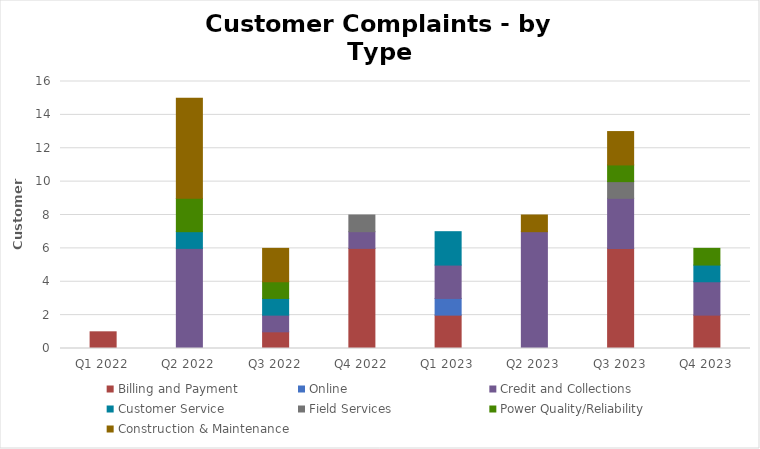
| Category | Billing and Payment | Online | Credit and Collections | Customer Service | Field Services | Power Quality/Reliability | Construction & Maintenance |
|---|---|---|---|---|---|---|---|
| Q1 2022 | 1 | 0 | 0 | 0 | 0 | 0 | 0 |
| Q2 2022 | 0 | 0 | 6 | 1 | 0 | 2 | 6 |
| Q3 2022 | 1 | 0 | 1 | 1 | 0 | 1 | 2 |
| Q4 2022 | 6 | 0 | 1 | 0 | 1 | 0 | 0 |
| Q1 2023 | 2 | 1 | 2 | 2 | 0 | 0 | 0 |
| Q2 2023 | 0 | 0 | 7 | 0 | 0 | 0 | 1 |
| Q3 2023 | 6 | 0 | 3 | 0 | 1 | 1 | 2 |
| Q4 2023 | 2 | 0 | 2 | 1 | 0 | 1 | 0 |